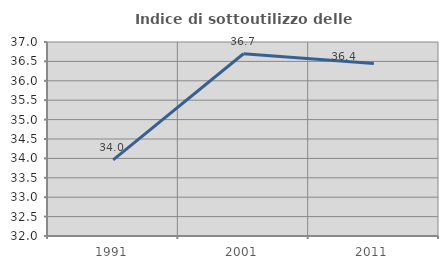
| Category | Indice di sottoutilizzo delle abitazioni  |
|---|---|
| 1991.0 | 33.962 |
| 2001.0 | 36.697 |
| 2011.0 | 36.449 |